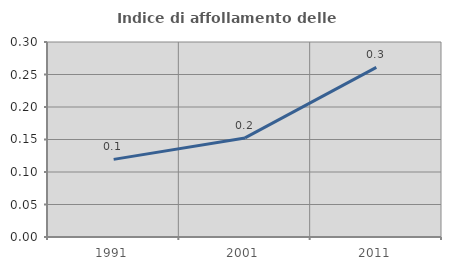
| Category | Indice di affollamento delle abitazioni  |
|---|---|
| 1991.0 | 0.119 |
| 2001.0 | 0.152 |
| 2011.0 | 0.261 |